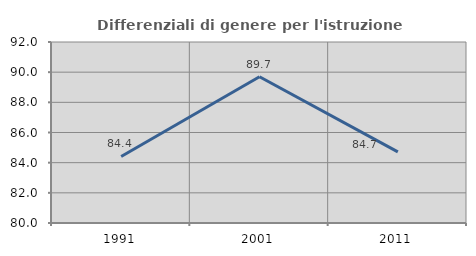
| Category | Differenziali di genere per l'istruzione superiore |
|---|---|
| 1991.0 | 84.409 |
| 2001.0 | 89.698 |
| 2011.0 | 84.72 |